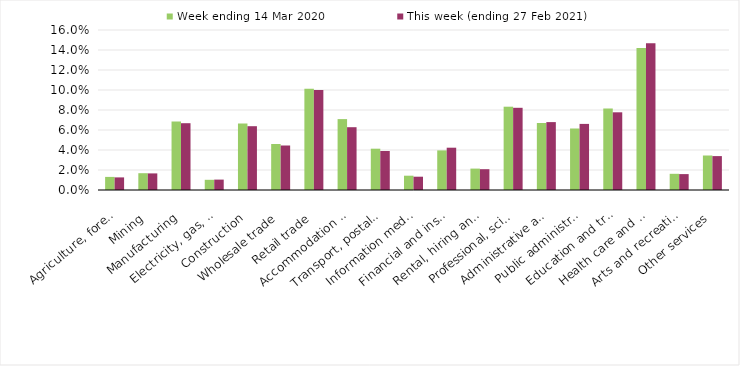
| Category | Week ending 14 Mar 2020 | This week (ending 27 Feb 2021) |
|---|---|---|
| Agriculture, forestry and fishing | 0.013 | 0.013 |
| Mining | 0.017 | 0.017 |
| Manufacturing | 0.068 | 0.067 |
| Electricity, gas, water and waste services | 0.01 | 0.01 |
| Construction | 0.066 | 0.064 |
| Wholesale trade | 0.046 | 0.044 |
| Retail trade | 0.101 | 0.1 |
| Accommodation and food services | 0.071 | 0.063 |
| Transport, postal and warehousing | 0.041 | 0.039 |
| Information media and telecommunications | 0.014 | 0.013 |
| Financial and insurance services | 0.04 | 0.042 |
| Rental, hiring and real estate services | 0.021 | 0.021 |
| Professional, scientific and technical services | 0.083 | 0.082 |
| Administrative and support services | 0.067 | 0.068 |
| Public administration and safety | 0.062 | 0.066 |
| Education and training | 0.082 | 0.078 |
| Health care and social assistance | 0.142 | 0.147 |
| Arts and recreation services | 0.016 | 0.016 |
| Other services | 0.034 | 0.034 |